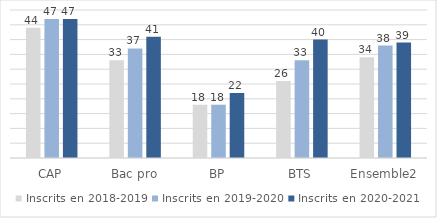
| Category | Inscrits en 2018-2019 | Inscrits en 2019-2020 | Inscrits en 2020-2021 |
|---|---|---|---|
| CAP | 44 | 47 | 47 |
| Bac pro | 33 | 37 | 41 |
| BP | 18 | 18 | 22 |
| BTS | 26 | 33 | 40 |
| Ensemble2 | 34 | 38 | 39 |